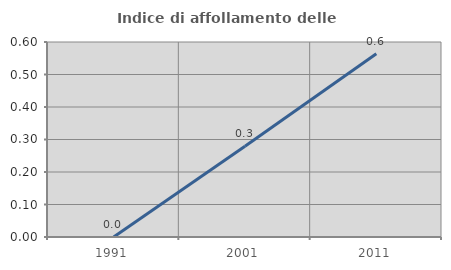
| Category | Indice di affollamento delle abitazioni  |
|---|---|
| 1991.0 | 0 |
| 2001.0 | 0.279 |
| 2011.0 | 0.564 |